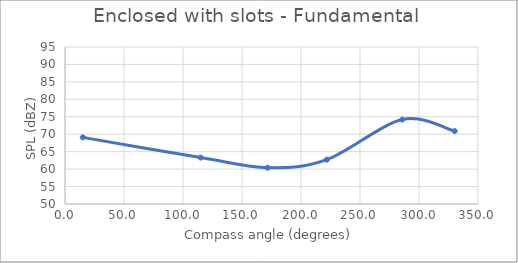
| Category | Series 0 |
|---|---|
| 15.06445125542554 | 69.1 |
| 115.00449447818254 | 63.3 |
| 171.7068171198818 | 60.4 |
| 221.8691292075067 | 62.7 |
| 285.7828166838848 | 74.2 |
| 330.28010595813004 | 70.9 |